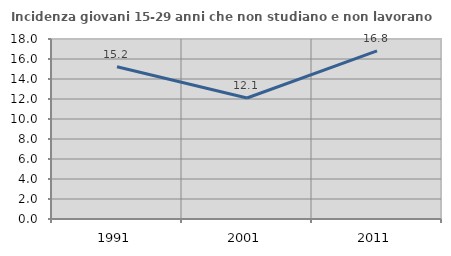
| Category | Incidenza giovani 15-29 anni che non studiano e non lavorano  |
|---|---|
| 1991.0 | 15.233 |
| 2001.0 | 12.101 |
| 2011.0 | 16.821 |